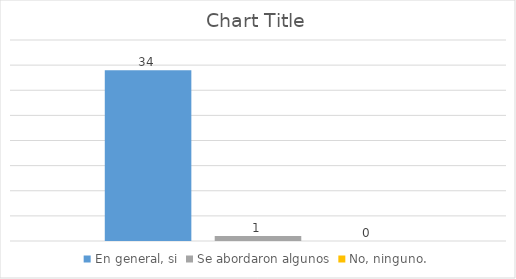
| Category | En general, si | Series 1 | Se abordaron algunos | No, ninguno. |
|---|---|---|---|---|
| 0.0 | 34 |  | 1 | 0 |